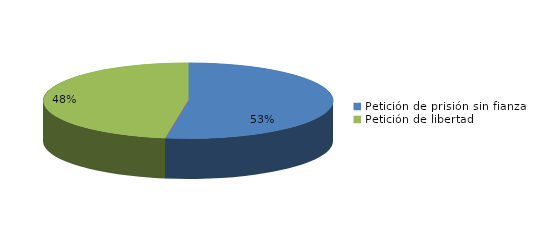
| Category | Series 0 |
|---|---|
| Petición de prisión sin fianza | 63 |
| Peticion de libertad con fianza | 0 |
| Petición de libertad | 57 |